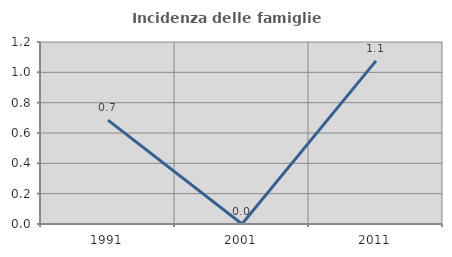
| Category | Incidenza delle famiglie numerose |
|---|---|
| 1991.0 | 0.685 |
| 2001.0 | 0 |
| 2011.0 | 1.075 |